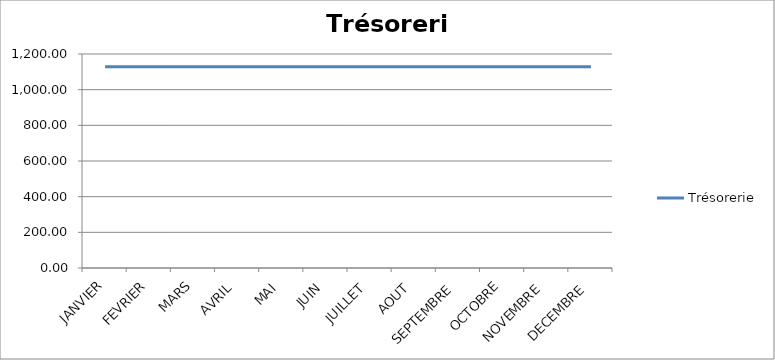
| Category | Trésorerie |
|---|---|
| JANVIER | 1129 |
| FEVRIER | 1129 |
| MARS | 1129 |
| AVRIL | 1129 |
| MAI | 1129 |
| JUIN | 1129 |
| JUILLET | 1129 |
| AOUT | 1129 |
| SEPTEMBRE | 1129 |
| OCTOBRE | 1129 |
| NOVEMBRE | 1129 |
| DECEMBRE | 1129 |